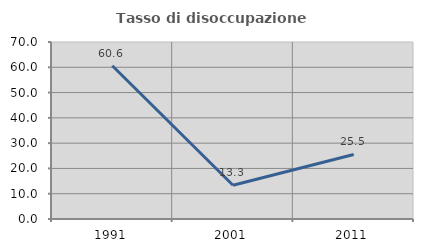
| Category | Tasso di disoccupazione giovanile  |
|---|---|
| 1991.0 | 60.606 |
| 2001.0 | 13.333 |
| 2011.0 | 25.532 |